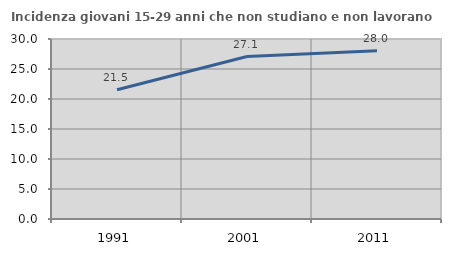
| Category | Incidenza giovani 15-29 anni che non studiano e non lavorano  |
|---|---|
| 1991.0 | 21.537 |
| 2001.0 | 27.083 |
| 2011.0 | 28.049 |